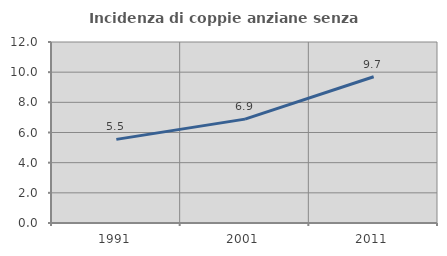
| Category | Incidenza di coppie anziane senza figli  |
|---|---|
| 1991.0 | 5.543 |
| 2001.0 | 6.887 |
| 2011.0 | 9.696 |